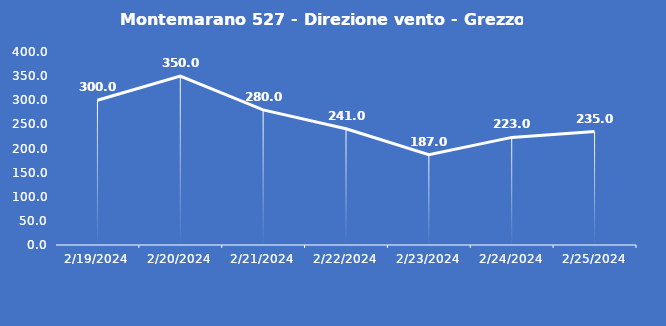
| Category | Montemarano 527 - Direzione vento - Grezzo (°N) |
|---|---|
| 2/19/24 | 300 |
| 2/20/24 | 350 |
| 2/21/24 | 280 |
| 2/22/24 | 241 |
| 2/23/24 | 187 |
| 2/24/24 | 223 |
| 2/25/24 | 235 |